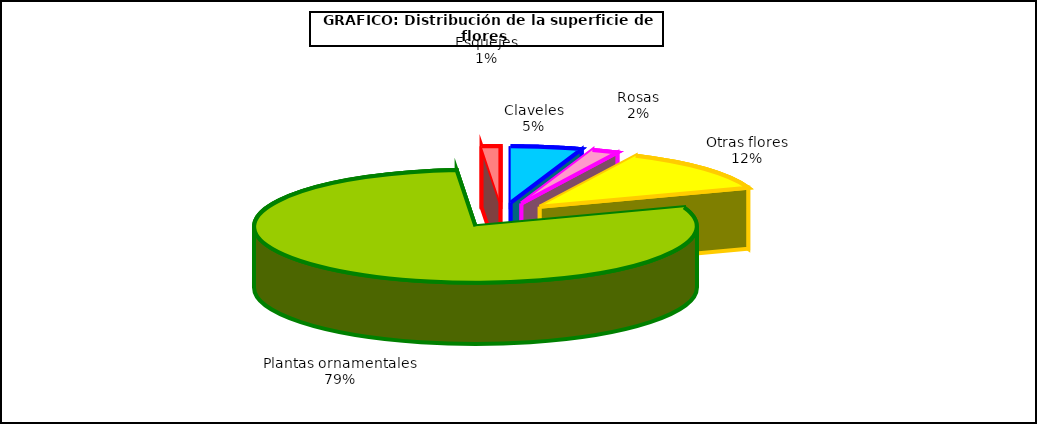
| Category | Series 0 |
|---|---|
| 0 | 33880 |
| 1 | 12651 |
| 2 | 80884 |
| 3 | 516392 |
| 4 | 8856 |